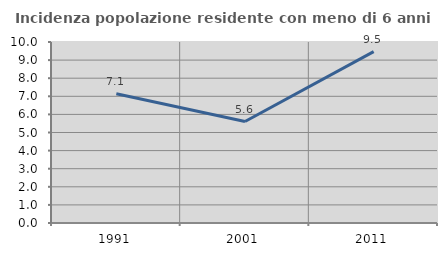
| Category | Incidenza popolazione residente con meno di 6 anni |
|---|---|
| 1991.0 | 7.139 |
| 2001.0 | 5.607 |
| 2011.0 | 9.465 |